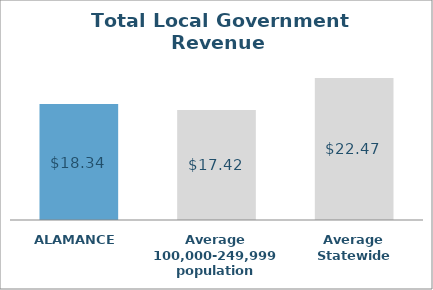
| Category | Series 0 |
|---|---|
| ALAMANCE | 18.345 |
| Average 100,000-249,999 population | 17.424 |
| Average Statewide | 22.473 |